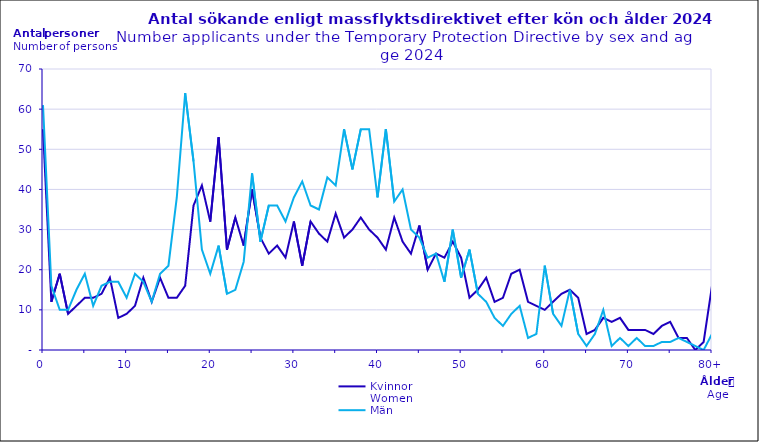
| Category | Kvinnor
Women | Män
Men |
|---|---|---|
| 0 | 55 | 61 |
| 1 | 12 | 16 |
| 2 | 19 | 10 |
| 3 | 9 | 10 |
| 4 | 11 | 15 |
| 5 | 13 | 19 |
| 6 | 13 | 11 |
| 7 | 14 | 16 |
| 8 | 18 | 17 |
| 9 | 8 | 17 |
| 10 | 9 | 13 |
| 11 | 11 | 19 |
| 12 | 18 | 17 |
| 13 | 12 | 12 |
| 14 | 18 | 19 |
| 15 | 13 | 21 |
| 16 | 13 | 38 |
| 17 | 16 | 64 |
| 18 | 36 | 47 |
| 19 | 41 | 25 |
| 20 | 32 | 19 |
| 21 | 53 | 26 |
| 22 | 25 | 14 |
| 23 | 33 | 15 |
| 24 | 26 | 22 |
| 25 | 40 | 44 |
| 26 | 28 | 27 |
| 27 | 24 | 36 |
| 28 | 26 | 36 |
| 29 | 23 | 32 |
| 30 | 32 | 38 |
| 31 | 21 | 42 |
| 32 | 32 | 36 |
| 33 | 29 | 35 |
| 34 | 27 | 43 |
| 35 | 34 | 41 |
| 36 | 28 | 55 |
| 37 | 30 | 45 |
| 38 | 33 | 55 |
| 39 | 30 | 55 |
| 40 | 28 | 38 |
| 41 | 25 | 55 |
| 42 | 33 | 37 |
| 43 | 27 | 40 |
| 44 | 24 | 30 |
| 45 | 31 | 28 |
| 46 | 20 | 23 |
| 47 | 24 | 24 |
| 48 | 23 | 17 |
| 49 | 27 | 30 |
| 50 | 23 | 18 |
| 51 | 13 | 25 |
| 52 | 15 | 14 |
| 53 | 18 | 12 |
| 54 | 12 | 8 |
| 55 | 13 | 6 |
| 56 | 19 | 9 |
| 57 | 20 | 11 |
| 58 | 12 | 3 |
| 59 | 11 | 4 |
| 60 | 10 | 21 |
| 61 | 12 | 9 |
| 62 | 14 | 6 |
| 63 | 15 | 15 |
| 64 | 13 | 4 |
| 65 | 4 | 1 |
| 66 | 5 | 4 |
| 67 | 8 | 10 |
| 68 | 7 | 1 |
| 69 | 8 | 3 |
| 70 | 5 | 1 |
| 71 | 5 | 3 |
| 72 | 5 | 1 |
| 73 | 4 | 1 |
| 74 | 6 | 2 |
| 75 | 7 | 2 |
| 76 | 3 | 3 |
| 77 | 3 | 2 |
| 78 | 0 | 1 |
| 79 | 2 | 0 |
| 80+ | 16 | 4 |